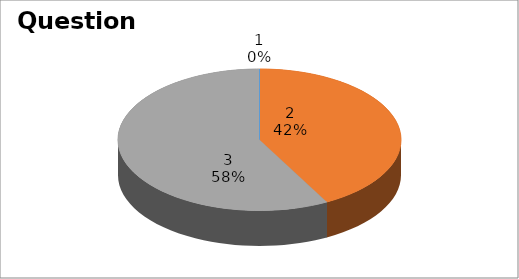
| Category | Series 0 |
|---|---|
| 0 | 0 |
| 1 | 8 |
| 2 | 11 |